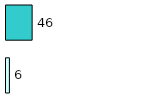
| Category | Series 0 | Series 1 |
|---|---|---|
| 0 | 6 | 46 |